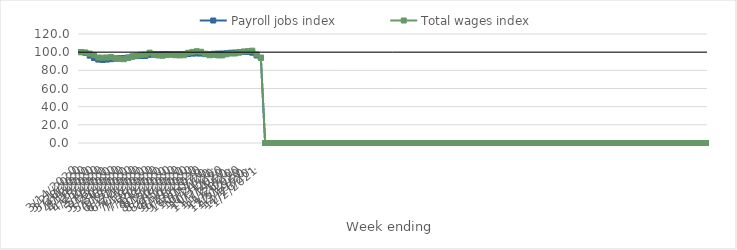
| Category | Payroll jobs index | Total wages index |
|---|---|---|
| 14/03/2020 | 100 | 100 |
| 21/03/2020 | 99.218 | 99.669 |
| 28/03/2020 | 96.159 | 98.38 |
| 04/04/2020 | 93.511 | 96.663 |
| 11/04/2020 | 91.845 | 94.08 |
| 18/04/2020 | 91.454 | 93.993 |
| 25/04/2020 | 91.82 | 94.131 |
| 02/05/2020 | 92.24 | 94.625 |
| 09/05/2020 | 92.814 | 93.438 |
| 16/05/2020 | 93.355 | 92.628 |
| 23/05/2020 | 93.675 | 92.257 |
| 30/05/2020 | 94.182 | 93.555 |
| 06/06/2020 | 95.129 | 95.487 |
| 13/06/2020 | 95.64 | 96.179 |
| 20/06/2020 | 95.803 | 97.167 |
| 27/06/2020 | 95.768 | 97.377 |
| 04/07/2020 | 97.026 | 99.465 |
| 11/07/2020 | 97.722 | 96.839 |
| 18/07/2020 | 97.64 | 96.355 |
| 25/07/2020 | 97.768 | 96.035 |
| 01/08/2020 | 97.912 | 96.762 |
| 08/08/2020 | 97.848 | 97.159 |
| 15/08/2020 | 97.715 | 96.636 |
| 22/08/2020 | 97.726 | 96.439 |
| 29/08/2020 | 97.792 | 96.622 |
| 05/09/2020 | 97.988 | 99.323 |
| 12/09/2020 | 98.415 | 100.272 |
| 19/09/2020 | 98.579 | 101.043 |
| 26/09/2020 | 98.452 | 100.421 |
| 03/10/2020 | 97.813 | 98.297 |
| 10/10/2020 | 97.688 | 96.578 |
| 17/10/2020 | 98.252 | 97.02 |
| 24/10/2020 | 98.419 | 96.422 |
| 31/10/2020 | 98.499 | 96.422 |
| 07/11/2020 | 98.826 | 97.695 |
| 14/11/2020 | 99.425 | 98.506 |
| 21/11/2020 | 99.648 | 98.519 |
| 28/11/2020 | 99.873 | 99.566 |
| 05/12/2020 | 100.204 | 100.773 |
| 12/12/2020 | 100.228 | 101.122 |
| 19/12/2020 | 99.39 | 101.653 |
| 26/12/2020 | 96.352 | 97.474 |
| 02/01/2021 | 93.927 | 93.755 |